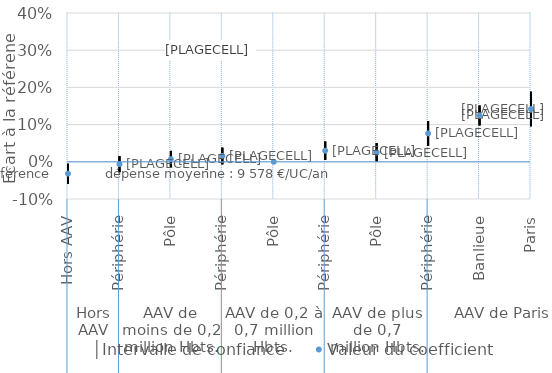
| Category | │Intervalle de confiance | Series 1 | Valeur du coefficient |
|---|---|---|---|
| 0 | -0.005 | -0.059 | -0.032 |
| 1 | 0.015 | -0.028 | -0.006 |
| 2 | 0.029 | -0.015 | 0.007 |
| 3 | 0.038 | -0.007 | 0.016 |
| 4 | 0 | 0 | 0 |
| 5 | 0.054 | 0.005 | 0.03 |
| 6 | 0.05 | 0 | 0.025 |
| 7 | 0.11 | 0.043 | 0.076 |
| 8 | 0.151 | 0.098 | 0.125 |
| 9 | 0.188 | 0.096 | 0.142 |